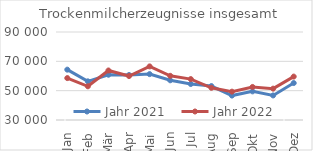
| Category | Jahr 2021 | Jahr 2022 |
|---|---|---|
| Jan | 64326.917 | 58575.881 |
| Feb | 56359.691 | 52986.291 |
| Mär | 60871.814 | 63762.244 |
| Apr | 60679.871 | 59968.313 |
| Mai | 61281.826 | 66542.953 |
| Jun | 57072.802 | 60122.961 |
| Jul | 54541.638 | 57893.834 |
| Aug | 53138.859 | 51950.084 |
| Sep | 46658.637 | 49324.119 |
| Okt | 49520.795 | 52536.603 |
| Nov | 46743.224 | 51373.127 |
| Dez | 55197.615 | 59602.333 |